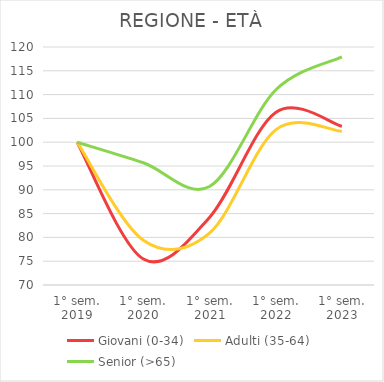
| Category | Giovani (0-34) | Adulti (35-64) | Senior (>65) |
|---|---|---|---|
| 1° sem.
2019 | 100 | 100 | 100 |
| 1° sem.
2020 | 75.472 | 79.415 | 95.681 |
| 1° sem.
2021 | 84.197 | 80.905 | 90.698 |
| 1° sem.
2022 | 106.259 | 102.6 | 110.963 |
| 1° sem.
2023 | 103.345 | 102.274 | 117.94 |